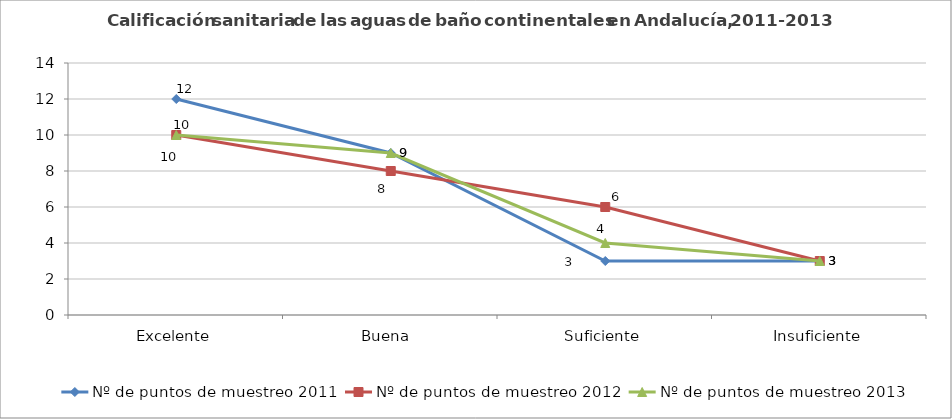
| Category | Nº de puntos de muestreo 2011 | Nº de puntos de muestreo 2012 | Nº de puntos de muestreo 2013 |
|---|---|---|---|
| Excelente | 12 | 10 | 10 |
| Buena  | 9 | 8 | 9 |
| Suficiente | 3 | 6 | 4 |
| Insuficiente | 3 | 3 | 3 |